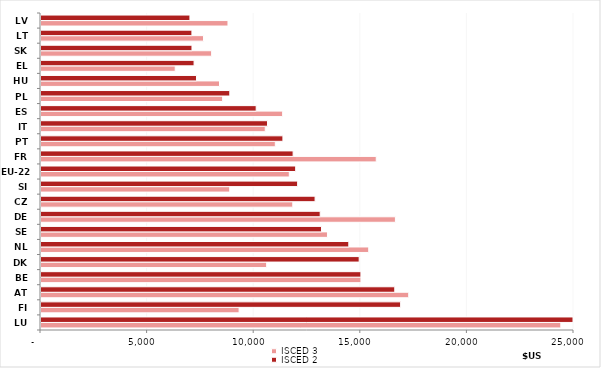
| Category | ISCED 3 | ISCED 2 |
|---|---|---|
| LU | 24380.79 | 25140.93 |
| FI | 9291.717 | 16868.69 |
| AT | 17248.25 | 16593.75 |
| BE | 15007.21 | 15005.33 |
| DK | 10584.33 | 14924.36 |
| NL | 15371.63 | 14437.63 |
| SE | 13437.07 | 13158.04 |
| DE | 16623.89 | 13095.69 |
| CZ | 11809.89 | 12855.98 |
| SI | 8852.577 | 12036.89 |
| EU-22 | 11646.267 | 11945.399 |
| FR | 15724.83 | 11825.47 |
| PT | 10990.83 | 11347.05 |
| IT | 10518.51 | 10623.15 |
| ES | 11334.19 | 10092.69 |
| PL | 8519.405 | 8856.016 |
| HU | 8373.018 | 7293.464 |
| EL | 6295.895 | 7179.343 |
| SK | 8003.166 | 7081.608 |
| LT | 7621.634 | 7078.816 |
| LV | 8769.723 | 6985.752 |